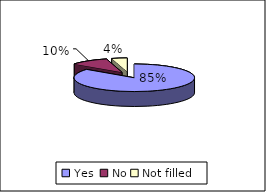
| Category | Prior to the procedure you were given an anaesthetic - did this work |
|---|---|
| Yes  | 82 |
| No | 10 |
| Not filled | 4 |